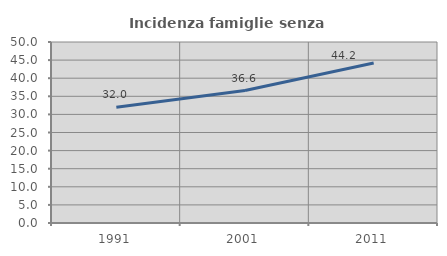
| Category | Incidenza famiglie senza nuclei |
|---|---|
| 1991.0 | 31.967 |
| 2001.0 | 36.585 |
| 2011.0 | 44.215 |